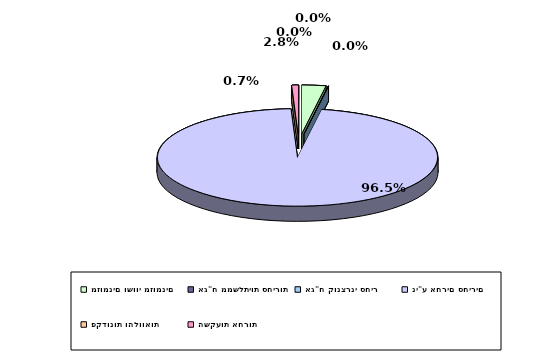
| Category | Series 0 |
|---|---|
| מזומנים ושווי מזומנים | 0.028 |
| אג"ח ממשלתיות סחירות | 0 |
| אג"ח קונצרני סחיר | 0 |
| ני"ע אחרים סחירים | 0.965 |
| פקדונות והלוואות | 0 |
| השקעות אחרות | 0.007 |